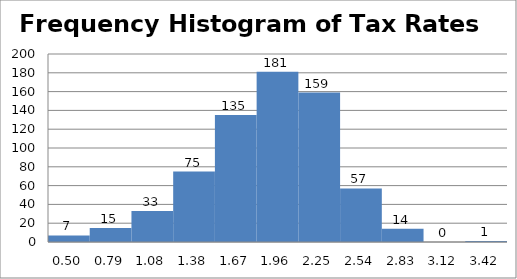
| Category | Frequency of Tax Rates |
|---|---|
| 0.5010805755333178 | 7 |
| 0.7925062599012933 | 15 |
| 1.0839319442692688 | 33 |
| 1.3753576286372442 | 75 |
| 1.6667833130052196 | 135 |
| 1.958208997373195 | 181 |
| 2.2496346817411705 | 159 |
| 2.541060366109146 | 57 |
| 2.8324860504771214 | 14 |
| 3.123911734845097 | 0 |
| 3.4153374192130728 | 1 |